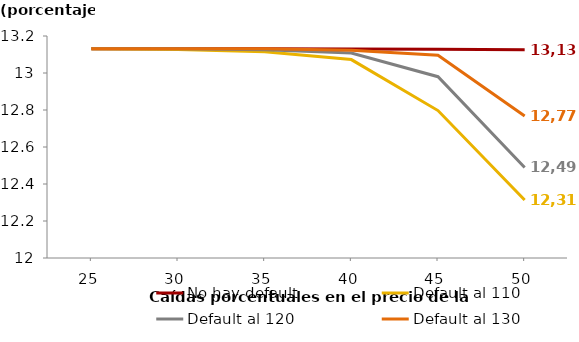
| Category | No hay default | Default al 110 | Default al 120 | Default al 130 |
|---|---|---|---|---|
| 25.0 | 13.131 | 13.131 | 13.131 | 13.131 |
| 30.0 | 13.131 | 13.127 | 13.131 | 13.131 |
| 35.0 | 13.131 | 13.115 | 13.126 | 13.131 |
| 40.0 | 13.13 | 13.073 | 13.108 | 13.124 |
| 45.0 | 13.128 | 12.797 | 12.98 | 13.096 |
| 50.0 | 13.126 | 12.313 | 12.489 | 12.767 |